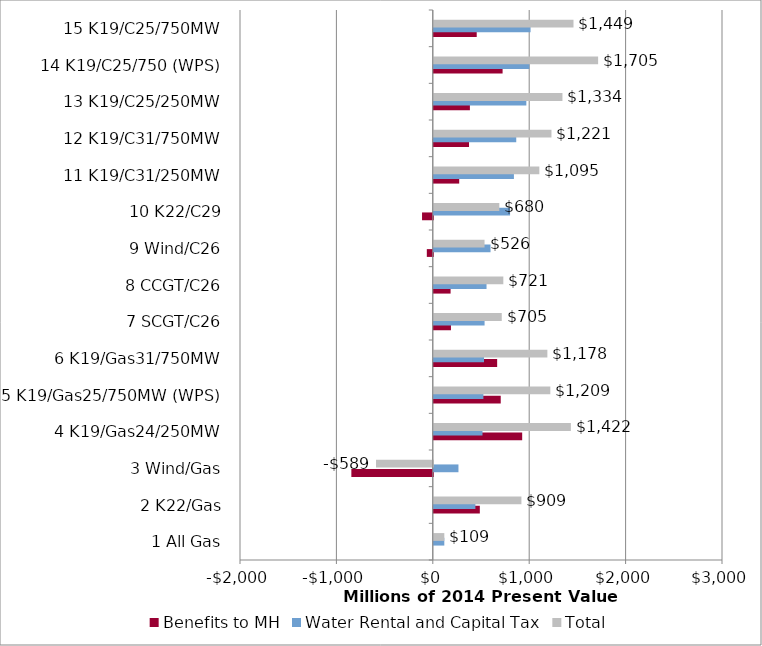
| Category | Benefits to MH | Water Rental and Capital Tax | Total |
|---|---|---|---|
| 1 All Gas | 0 | 109.002 | 109.002 |
| 2 K22/Gas | 477.442 | 431.47 | 908.911 |
| 3 Wind/Gas | -844.801 | 255.745 | -589.056 |
| 4 K19/Gas24/250MW | 916.811 | 505.007 | 1421.818 |
| 5 K19/Gas25/750MW (WPS) | 694.305 | 514.53 | 1208.836 |
| 6 K19/Gas31/750MW | 657.198 | 520.95 | 1178.148 |
| 7 SCGT/C26 | 178.082 | 526.747 | 704.83 |
| 8 CCGT/C26 | 174.231 | 547.048 | 721.28 |
| 9 Wind/C26 | -62.083 | 588.556 | 526.473 |
| 10 K22/C29 | -111.603 | 791.256 | 679.653 |
| 11 K19/C31/250MW | 263.689 | 831.113 | 1094.802 |
| 12 K19/C31/750MW | 365.394 | 855.229 | 1220.623 |
| 13 K19/C25/250MW | 374.478 | 960.019 | 1334.496 |
| 14 K19/C25/750 (WPS) | 713.609 | 990.978 | 1704.587 |
| 15 K19/C25/750MW | 445.221 | 1003.883 | 1449.104 |